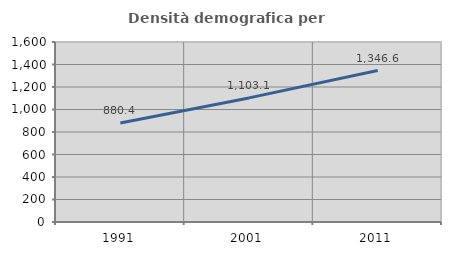
| Category | Densità demografica |
|---|---|
| 1991.0 | 880.423 |
| 2001.0 | 1103.063 |
| 2011.0 | 1346.611 |